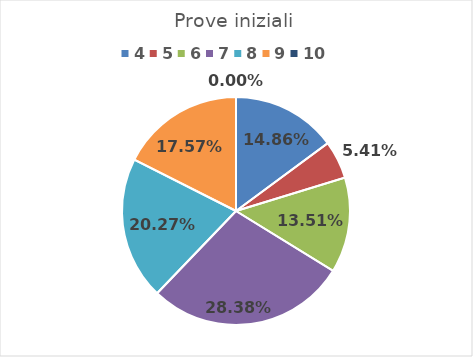
| Category | Series 0 |
|---|---|
| 4.0 | 0.149 |
| 5.0 | 0.054 |
| 6.0 | 0.135 |
| 7.0 | 0.284 |
| 8.0 | 0.203 |
| 9.0 | 0.176 |
| 10.0 | 0 |